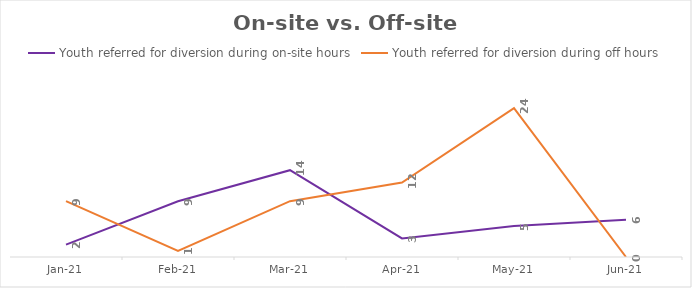
| Category | Youth referred for diversion during on-site hours | Youth referred for diversion during off hours |
|---|---|---|
| 2021-01-01 | 2 | 9 |
| 2021-02-01 | 9 | 1 |
| 2021-03-01 | 14 | 9 |
| 2021-04-01 | 3 | 12 |
| 2021-05-01 | 5 | 24 |
| 2021-06-01 | 6 | 0 |